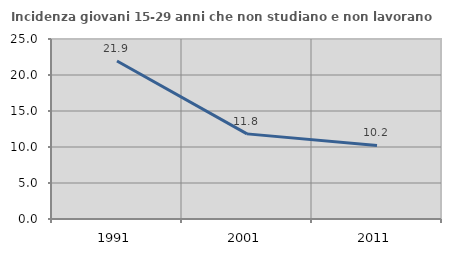
| Category | Incidenza giovani 15-29 anni che non studiano e non lavorano  |
|---|---|
| 1991.0 | 21.944 |
| 2001.0 | 11.823 |
| 2011.0 | 10.219 |